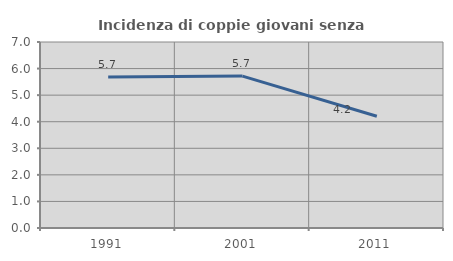
| Category | Incidenza di coppie giovani senza figli |
|---|---|
| 1991.0 | 5.684 |
| 2001.0 | 5.718 |
| 2011.0 | 4.204 |